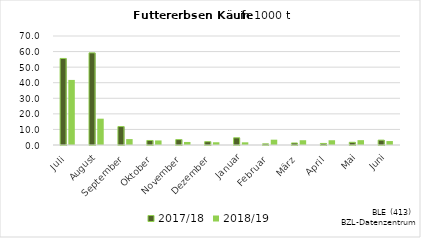
| Category | 2017/18 | 2018/19 |
|---|---|---|
| Juli | 55.585 | 41.792 |
| August | 59.166 | 16.899 |
| September | 11.849 | 3.798 |
| Oktober | 2.895 | 2.927 |
| November | 3.465 | 1.951 |
| Dezember | 2.136 | 1.761 |
| Januar | 4.627 | 1.727 |
| Februar | 0.733 | 3.413 |
| März | 1.296 | 3.063 |
| April | 0.994 | 3.059 |
| Mai | 1.741 | 3.112 |
| Juni | 3.138 | 2.537 |